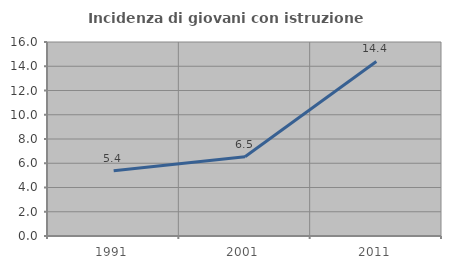
| Category | Incidenza di giovani con istruzione universitaria |
|---|---|
| 1991.0 | 5.389 |
| 2001.0 | 6.538 |
| 2011.0 | 14.392 |